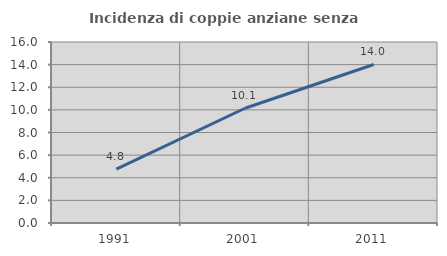
| Category | Incidenza di coppie anziane senza figli  |
|---|---|
| 1991.0 | 4.762 |
| 2001.0 | 10.145 |
| 2011.0 | 14.013 |